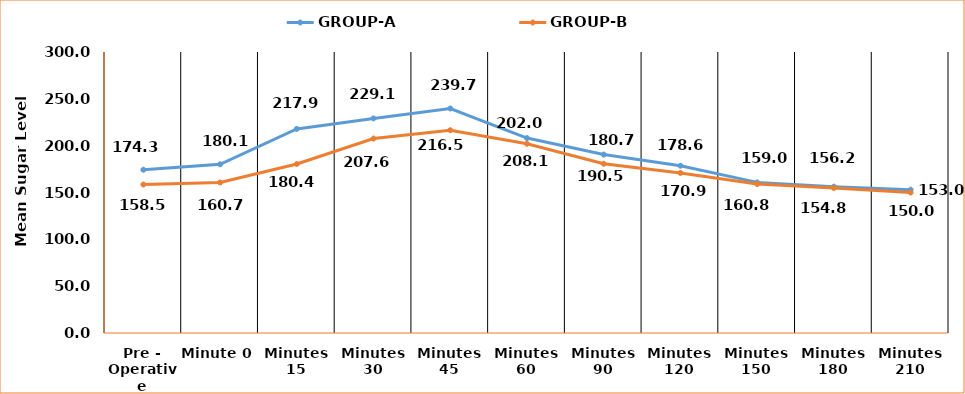
| Category | GROUP-A | GROUP-B |
|---|---|---|
| Pre - Operative | 174.3 | 158.5 |
| Minute 0 | 180.1 | 160.7 |
| Minutes 15 | 217.9 | 180.4 |
| Minutes 30 | 229.1 | 207.6 |
| Minutes 45 | 239.7 | 216.5 |
| Minutes 60 | 208.1 | 202 |
| Minutes 90 | 190.5 | 180.7 |
| Minutes 120 | 178.6 | 170.9 |
| Minutes 150 | 160.8 | 159 |
| Minutes 180 | 156.2 | 154.8 |
| Minutes 210 | 153 | 150 |